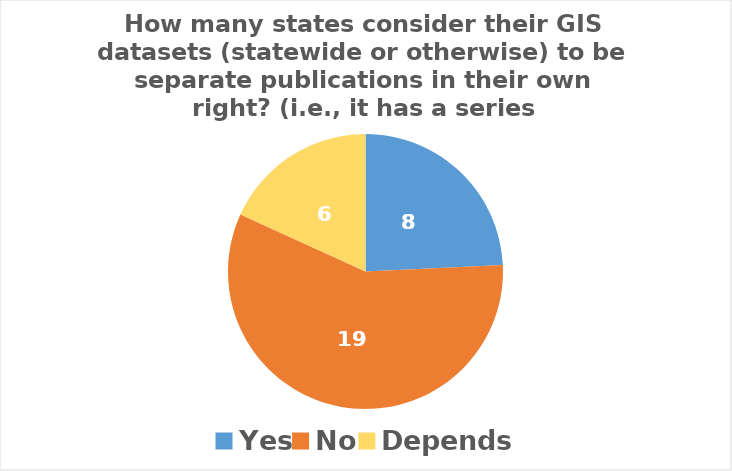
| Category | Series 0 |
|---|---|
| Yes | 8 |
| No | 19 |
| Depends | 6 |